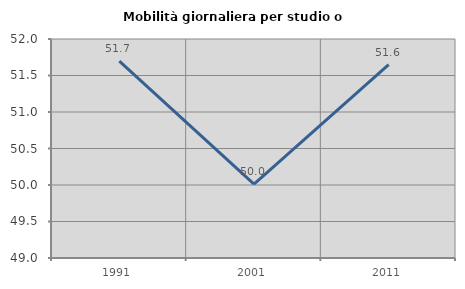
| Category | Mobilità giornaliera per studio o lavoro |
|---|---|
| 1991.0 | 51.697 |
| 2001.0 | 50.012 |
| 2011.0 | 51.647 |